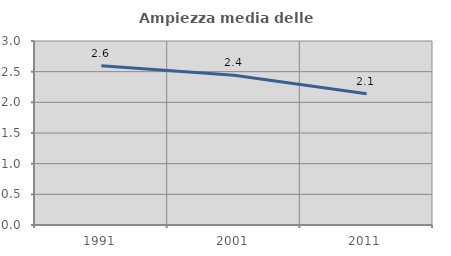
| Category | Ampiezza media delle famiglie |
|---|---|
| 1991.0 | 2.595 |
| 2001.0 | 2.443 |
| 2011.0 | 2.141 |